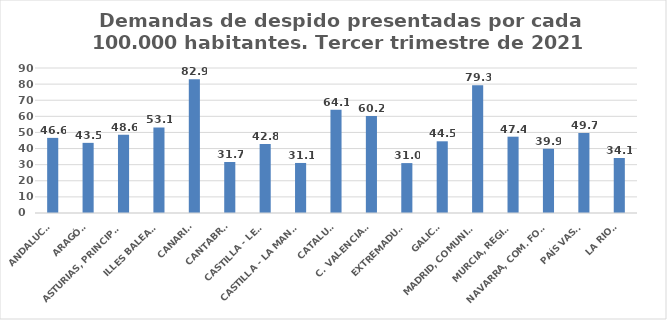
| Category | Series 0 |
|---|---|
| ANDALUCÍA | 46.624 |
| ARAGÓN | 43.535 |
| ASTURIAS, PRINCIPADO | 48.638 |
| ILLES BALEARS | 53.142 |
| CANARIAS | 82.943 |
| CANTABRIA | 31.661 |
| CASTILLA - LEÓN | 42.834 |
| CASTILLA - LA MANCHA | 31.058 |
| CATALUÑA | 64.072 |
| C. VALENCIANA | 60.185 |
| EXTREMADURA | 30.98 |
| GALICIA | 44.502 |
| MADRID, COMUNIDAD | 79.267 |
| MURCIA, REGIÓN | 47.367 |
| NAVARRA, COM. FORAL | 39.938 |
| PAÍS VASCO | 49.671 |
| LA RIOJA | 34.145 |